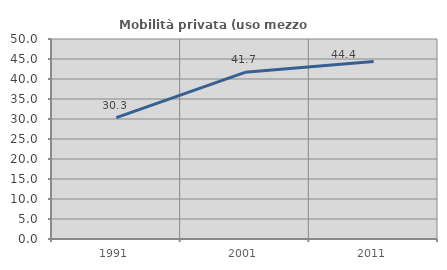
| Category | Mobilità privata (uso mezzo privato) |
|---|---|
| 1991.0 | 30.335 |
| 2001.0 | 41.661 |
| 2011.0 | 44.375 |